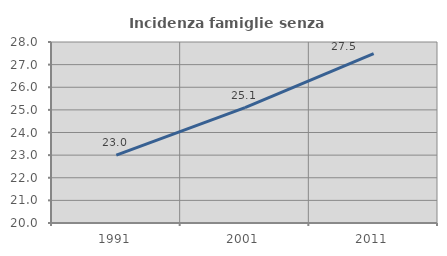
| Category | Incidenza famiglie senza nuclei |
|---|---|
| 1991.0 | 23 |
| 2001.0 | 25.101 |
| 2011.0 | 27.483 |